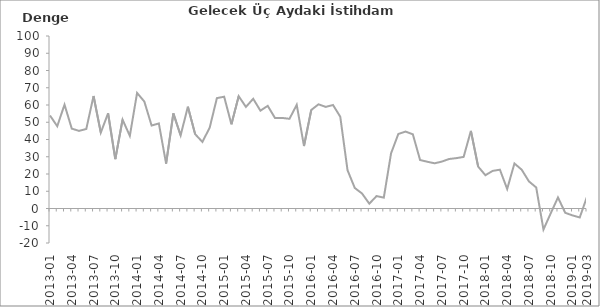
| Category | Denge  |
|---|---|
| 2013-01 | 53.9 |
|  | 47.7 |
|  | 60.2 |
| 2013-04 | 46.3 |
|  | 45 |
|  | 46.1 |
| 2013-07 | 65.2 |
|  | 44 |
|  | 55.2 |
| 2013-10 | 28.6 |
|  | 51.5 |
|  | 42.1 |
| 2014-01 | 67 |
|  | 62 |
|  | 48.1 |
| 2014-04 | 49.3 |
|  | 26 |
|  | 55.1 |
| 2014-07 | 42.4 |
|  | 59 |
|  | 43.1 |
| 2014-10 | 38.6 |
|  | 46.8 |
|  | 64 |
| 2015-01 | 64.8 |
|  | 48.8 |
|  | 65.1 |
| 2015-04 | 58.9 |
|  | 63.6 |
|  | 56.7 |
| 2015-07 | 59.5 |
|  | 52.5 |
|  | 52.5 |
| 2015-10 | 52 |
|  | 60.1 |
|  | 36.2 |
| 2016-01 | 57.1 |
|  | 60.4 |
|  | 58.9 |
| 2016-04 | 60 |
|  | 53.2 |
|  | 22.2 |
| 2016-07 | 11.9 |
|  | 8.7 |
|  | 2.8 |
| 2016-10 | 7.2 |
|  | 6.3 |
|  | 32 |
| 2017-01 | 43.2 |
|  | 44.6 |
|  | 43 |
| 2017-04 | 28.1 |
|  | 27.1 |
|  | 26.2 |
| 2017-07 | 27.2 |
|  | 28.7 |
|  | 29.2 |
| 2017-10 | 29.9 |
|  | 45 |
|  | 24.3 |
| 2018-01 | 19.3 |
|  | 21.8 |
|  | 22.5 |
| 2018-04 | 11.3 |
|  | 26.1 |
|  | 22.5 |
| 2018-07 | 15.7 |
|  | 12.2 |
|  | -12.2 |
| 2018-10 | -2.8 |
|  | 6.4 |
|  | -2.5 |
| 2019-01 | -4 |
|  | -5.2 |
| 2019-03 | 6.8 |